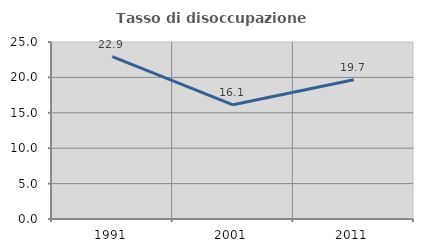
| Category | Tasso di disoccupazione giovanile  |
|---|---|
| 1991.0 | 22.936 |
| 2001.0 | 16.129 |
| 2011.0 | 19.658 |